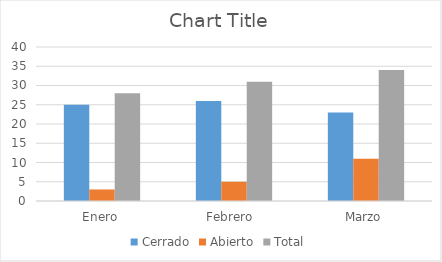
| Category | Cerrado | Abierto | Total |
|---|---|---|---|
| Enero | 25 | 3 | 28 |
| Febrero  | 26 | 5 | 31 |
| Marzo | 23 | 11 | 34 |